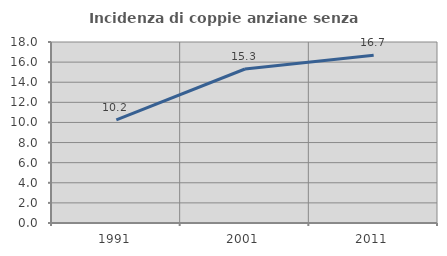
| Category | Incidenza di coppie anziane senza figli  |
|---|---|
| 1991.0 | 10.248 |
| 2001.0 | 15.316 |
| 2011.0 | 16.69 |